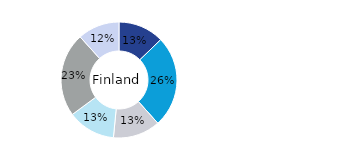
| Category | Finland |
|---|---|
| Office | 0.128 |
| Residential | 0.256 |
| Retail | 0.132 |
| Logistics* | 0.133 |
| Public Sector** | 0.234 |
| Other | 0.117 |